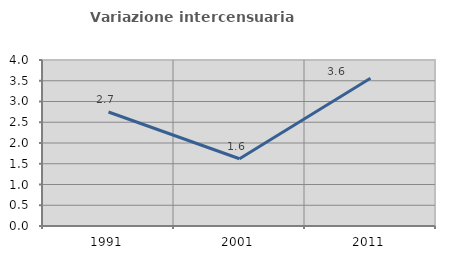
| Category | Variazione intercensuaria annua |
|---|---|
| 1991.0 | 2.747 |
| 2001.0 | 1.621 |
| 2011.0 | 3.558 |